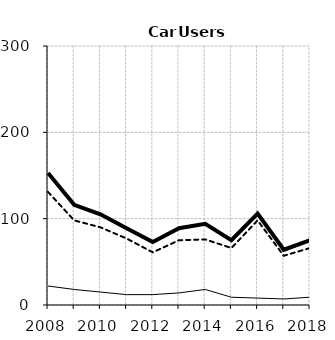
| Category | Built-up | Non built-up | Total |
|---|---|---|---|
| 2008.0 | 22 | 131 | 153 |
| 2009.0 | 18 | 98 | 116 |
| 2010.0 | 15 | 90 | 105 |
| 2011.0 | 12 | 77 | 89 |
| 2012.0 | 12 | 61 | 73 |
| 2013.0 | 14 | 75 | 89 |
| 2014.0 | 18 | 76 | 94 |
| 2015.0 | 9 | 66 | 75 |
| 2016.0 | 8 | 98 | 106 |
| 2017.0 | 7 | 57 | 64 |
| 2018.0 | 9 | 66 | 75 |